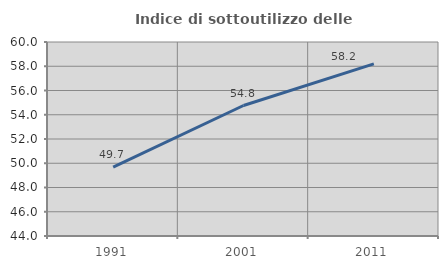
| Category | Indice di sottoutilizzo delle abitazioni  |
|---|---|
| 1991.0 | 49.682 |
| 2001.0 | 54.762 |
| 2011.0 | 58.197 |